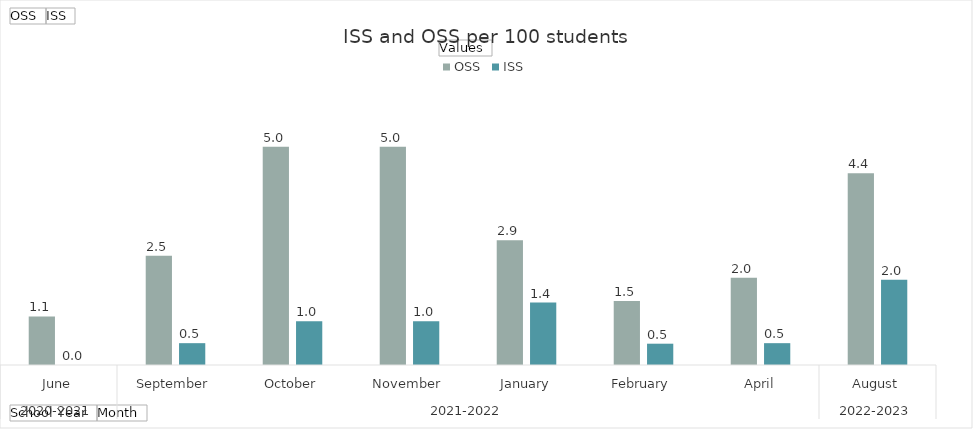
| Category | OSS | ISS |
|---|---|---|
| 0 | 1.111 | 0 |
| 1 | 2.5 | 0.5 |
| 2 | 5 | 1 |
| 3 | 5 | 1 |
| 4 | 2.857 | 1.429 |
| 5 | 1.463 | 0.488 |
| 6 | 2 | 0.5 |
| 7 | 4.39 | 1.951 |